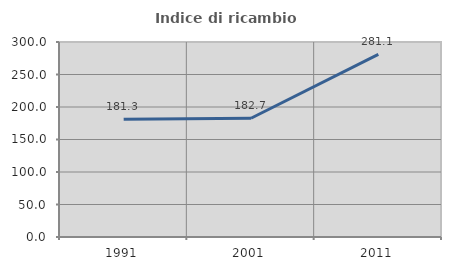
| Category | Indice di ricambio occupazionale  |
|---|---|
| 1991.0 | 181.25 |
| 2001.0 | 182.692 |
| 2011.0 | 281.081 |